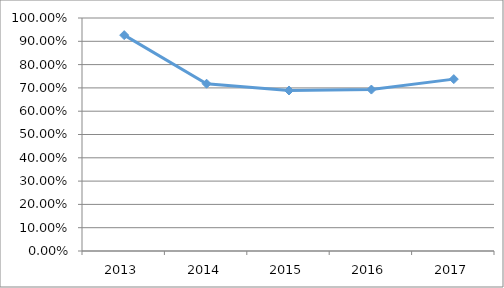
| Category | RMA2-M5O37 |
|---|---|
| 2013.0 | 0.926 |
| 2014.0 | 0.718 |
| 2015.0 | 0.689 |
| 2016.0 | 0.693 |
| 2017.0 | 0.738 |